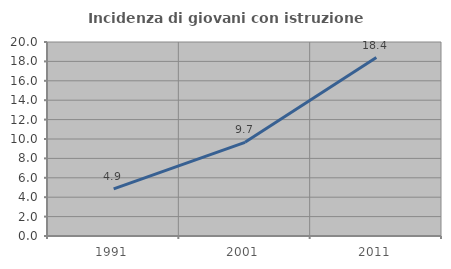
| Category | Incidenza di giovani con istruzione universitaria |
|---|---|
| 1991.0 | 4.851 |
| 2001.0 | 9.657 |
| 2011.0 | 18.398 |